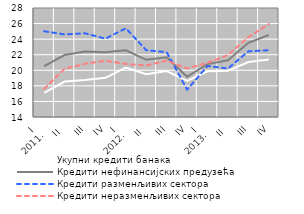
| Category | Укупни кредити банака | Кредити нефинансијских предузећа | Кредити разменљивих сектора | Кредити неразменљивих сектора |
|---|---|---|---|---|
| I 
2011. | 17.104 | 20.542 | 25.011 | 17.621 |
| II | 18.557 | 21.954 | 24.61 | 20.21 |
| III | 18.761 | 22.411 | 24.751 | 20.837 |
| IV | 19.034 | 22.326 | 24.06 | 21.222 |
| I 
2012. | 20.362 | 22.571 | 25.396 | 20.807 |
| II | 19.501 | 21.346 | 22.572 | 20.617 |
| III | 19.906 | 21.664 | 22.327 | 21.245 |
| IV | 18.625 | 19.185 | 17.514 | 20.233 |
| I 
2013. | 19.876 | 20.793 | 20.549 | 20.949 |
| II | 19.929 | 21.275 | 20.226 | 21.966 |
| III | 21.063 | 23.528 | 22.436 | 24.252 |
| IV | 21.374 | 24.536 | 22.58 | 25.94 |